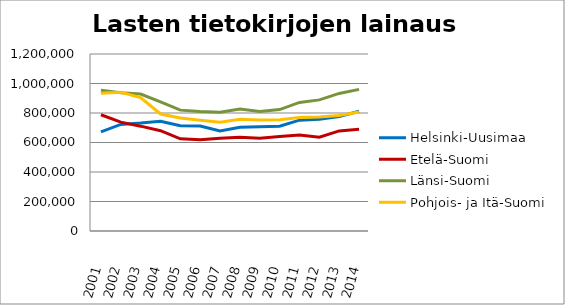
| Category | Helsinki-Uusimaa | Etelä-Suomi | Länsi-Suomi | Pohjois- ja Itä-Suomi |
|---|---|---|---|---|
| 2001.0 | 672423 | 788070 | 953790 | 933989 |
| 2002.0 | 722847 | 737802 | 937650 | 941155 |
| 2003.0 | 731836 | 710780 | 928767 | 904370 |
| 2004.0 | 743833 | 679954 | 875954 | 793165 |
| 2005.0 | 713194 | 624604 | 819468 | 765480 |
| 2006.0 | 712285 | 619398 | 809542 | 750317 |
| 2007.0 | 677627 | 628798 | 805505 | 736660 |
| 2008.0 | 702781 | 635724 | 826759 | 758106 |
| 2009.0 | 706313 | 629359 | 810325 | 752130 |
| 2010.0 | 710202 | 640131 | 823445 | 754603 |
| 2011.0 | 751347 | 650331 | 871796 | 768864 |
| 2012.0 | 757886 | 635355 | 888804 | 773057 |
| 2013.0 | 775603 | 678723 | 932674 | 783627 |
| 2014.0 | 812155 | 689180 | 960053 | 807106 |